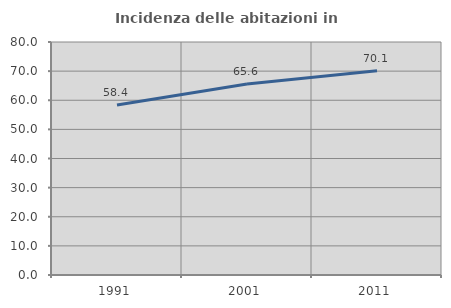
| Category | Incidenza delle abitazioni in proprietà  |
|---|---|
| 1991.0 | 58.402 |
| 2001.0 | 65.595 |
| 2011.0 | 70.12 |